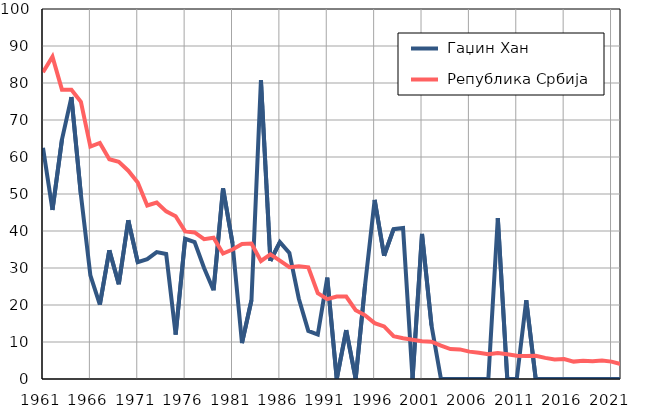
| Category |  Гаџин Хан |  Република Србија |
|---|---|---|
| 1961.0 | 62.5 | 82.9 |
| 1962.0 | 45.7 | 87.1 |
| 1963.0 | 64.7 | 78.2 |
| 1964.0 | 76.2 | 78.2 |
| 1965.0 | 49.8 | 74.9 |
| 1966.0 | 28 | 62.8 |
| 1967.0 | 20.1 | 63.8 |
| 1968.0 | 34.8 | 59.4 |
| 1969.0 | 25.6 | 58.7 |
| 1970.0 | 42.9 | 56.3 |
| 1971.0 | 31.6 | 53.1 |
| 1972.0 | 32.4 | 46.9 |
| 1973.0 | 34.3 | 47.7 |
| 1974.0 | 33.8 | 45.3 |
| 1975.0 | 12 | 44 |
| 1976.0 | 37.9 | 39.9 |
| 1977.0 | 37 | 39.6 |
| 1978.0 | 30 | 37.8 |
| 1979.0 | 24 | 38.2 |
| 1980.0 | 51.5 | 33.9 |
| 1981.0 | 36.7 | 35 |
| 1982.0 | 9.7 | 36.5 |
| 1983.0 | 21.3 | 36.6 |
| 1984.0 | 80.8 | 31.9 |
| 1985.0 | 31.9 | 33.7 |
| 1986.0 | 37 | 32 |
| 1987.0 | 34.1 | 30.2 |
| 1988.0 | 21.7 | 30.5 |
| 1989.0 | 13 | 30.2 |
| 1990.0 | 12 | 23.2 |
| 1991.0 | 27.4 | 21.6 |
| 1992.0 | 0 | 22.3 |
| 1993.0 | 13.2 | 22.3 |
| 1994.0 | 0 | 18.6 |
| 1995.0 | 25.6 | 17.2 |
| 1996.0 | 48.4 | 15.1 |
| 1997.0 | 33.3 | 14.2 |
| 1998.0 | 40.5 | 11.6 |
| 1999.0 | 40.8 | 11 |
| 2000.0 | 0 | 10.6 |
| 2001.0 | 39.2 | 10.2 |
| 2002.0 | 14.5 | 10.1 |
| 2003.0 | 0 | 9 |
| 2004.0 | 0 | 8.1 |
| 2005.0 | 0 | 8 |
| 2006.0 | 0 | 7.4 |
| 2007.0 | 0 | 7.1 |
| 2008.0 | 0 | 6.7 |
| 2009.0 | 43.5 | 7 |
| 2010.0 | 0 | 6.7 |
| 2011.0 | 0 | 6.3 |
| 2012.0 | 21.3 | 6.2 |
| 2013.0 | 0 | 6.3 |
| 2014.0 | 0 | 5.7 |
| 2015.0 | 0 | 5.3 |
| 2016.0 | 0 | 5.4 |
| 2017.0 | 0 | 4.7 |
| 2018.0 | 0 | 4.9 |
| 2019.0 | 0 | 4.8 |
| 2020.0 | 0 | 5 |
| 2021.0 | 0 | 4.7 |
| 2022.0 | 0 | 4 |